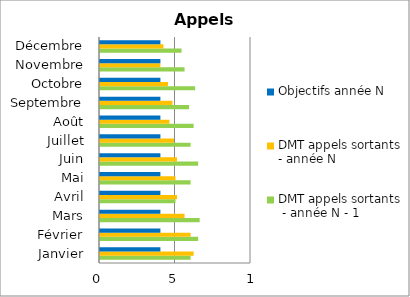
| Category | DMT appels sortants  - année N - 1 | DMT appels sortants - année N | Objectifs année N |
|---|---|---|---|
| Janvier | 6 | 6.2 | 4 |
| Février | 6.5 | 6 | 4 |
| Mars | 6.6 | 5.6 | 4 |
| Avril | 5 | 5.1 | 4 |
| Mai | 6 | 5 | 4 |
| Juin | 6.5 | 5.1 | 4 |
| Juillet | 6 | 4.9 | 4 |
| Août | 6.2 | 4.6 | 4 |
| Septembre | 5.9 | 4.8 | 4 |
| Octobre | 6.3 | 4.5 | 4 |
| Novembre | 5.6 | 4 | 4 |
| Décembre | 5.4 | 4.2 | 4 |